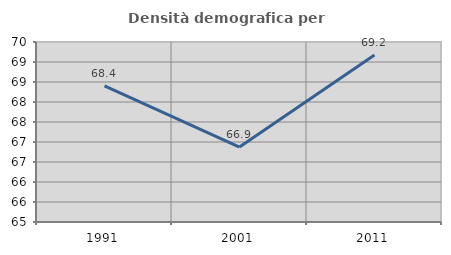
| Category | Densità demografica |
|---|---|
| 1991.0 | 68.401 |
| 2001.0 | 66.875 |
| 2011.0 | 69.175 |